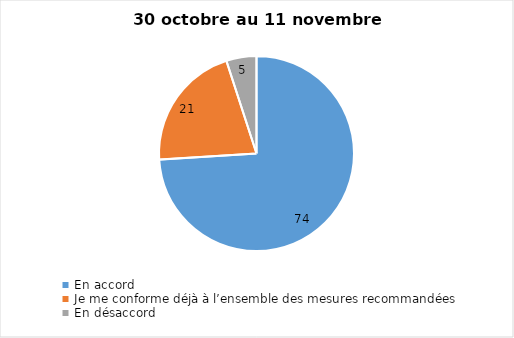
| Category | Series 0 |
|---|---|
| En accord | 74 |
| Je me conforme déjà à l’ensemble des mesures recommandées | 21 |
| En désaccord | 5 |